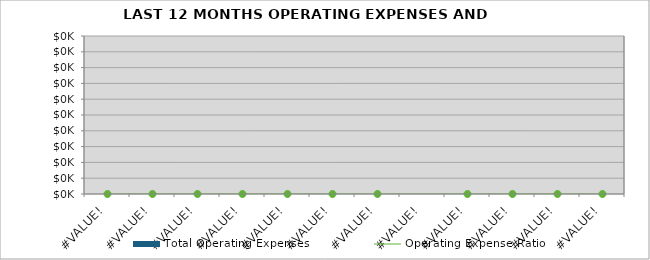
| Category | Total Operating Expenses |
|---|---|
| 0.0 | 0 |
| 0.0 | 0 |
| 0.0 | 0 |
| 0.0 | 0 |
| 0.0 | 0 |
| 0.0 | 0 |
| 0.0 | 0 |
| 0.0 | 0 |
| 0.0 | 0 |
| 0.0 | 0 |
| 0.0 | 0 |
| 0.0 | 0 |